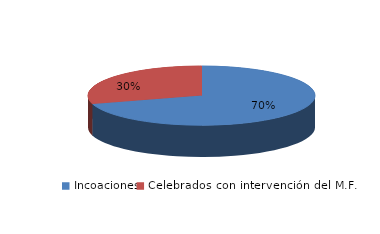
| Category | Series 0 |
|---|---|
| Incoaciones | 7034 |
| Celebrados con intervención del M.F. | 2955 |